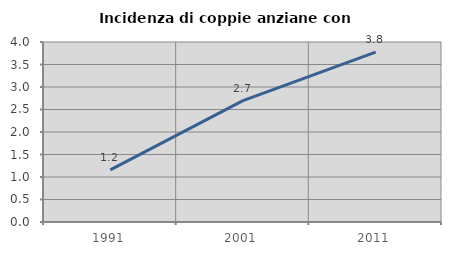
| Category | Incidenza di coppie anziane con figli |
|---|---|
| 1991.0 | 1.157 |
| 2001.0 | 2.697 |
| 2011.0 | 3.775 |